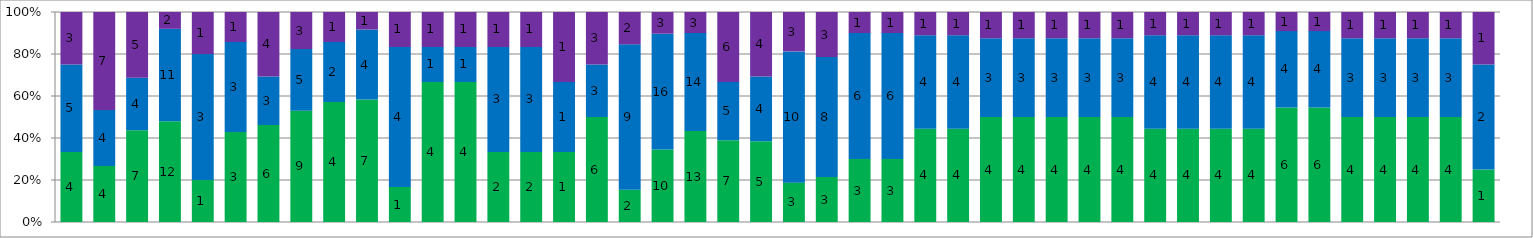
| Category | Wiedza | Umiejętności | Kompetencje społeczne |
|---|---|---|---|
| Podstawy psychoterapii | 4 | 5 | 3 |
| Filozofia i teoria opieki położniczej | 4 | 4 | 7 |
| Ustawodawstwo zawodowe położnej – wymogi europejskie | 7 | 4 | 5 |
| Zarządzanie w położnictwie | 12 | 11 | 2 |
| Egzamin magisterski seminarium magisterskie z promotorem | 1 | 3 | 1 |
| Przygotowanie do egzaminu magisteskiego teoretycznego i praktrycznego | 3 | 3 | 1 |
| Badania naukowe w położnictwie | 6 | 3 | 4 |
| Dydaktyka medyczna | 9 | 5 | 3 |
| Historia medycyny (Blok A i B) | 4 | 2 | 1 |
| Podstawy statystyki (Blok A i B) | 7 | 4 | 1 |
| Język angielski (Blok A i B) | 1 | 4 | 1 |
| Medycyna sądowa (Blok A) | 4 | 1 | 1 |
| Procedury sądowo-lekarskie w aspekcie zgonu pacjenta (Blok B) | 4 | 1 | 1 |
| Patologia i rehabilitacja mowy (Blok A) | 2 | 3 | 1 |
| Elementy logopedii i neurologopedii (Blok B) | 2 | 3 | 1 |
| Zajęcia fakultatywne (wolny wybór) | 1 | 1 | 1 |
| Nowoczesne techniki diagnostyczne | 6 | 3 | 3 |
| Diagnostyka ultrasonograficzna w położnictwie i ginekologii | 2 | 9 | 2 |
| Opieka specjalistyczna w położnictwie | 10 | 16 | 3 |
| Opieka specjalistyczna w ginekologii | 13 | 14 | 3 |
| Opieka specjalistyczna w neonatologii | 7 | 5 | 6 |
| Farmakologia kliniczna | 5 | 4 | 4 |
| Opieka środowiskowa nad kobietą i jej rodziną | 3 | 10 | 3 |
| Intensywny nadzór położniczy | 3 | 8 | 3 |
| Zakażenia szpitalne i leczenie ran (Blok A) | 3 | 6 | 1 |
| Pielęgniarstwo epidemiologiczne i leczenie ran (Blok B) | 3 | 6 | 1 |
| Medycyna prewencyjna w neonatologii (Blok A) | 4 | 4 | 1 |
| Profilaktyka chorób w neonatologii (Blok B) | 4 | 4 | 1 |
| Opieka paliatywna w perinatologii  (Blok A) | 4 | 3 | 1 |
| Opieka hospicyjna nad płodem i noworodkiem (Blok B) | 4 | 3 | 1 |
| Seksuologia | 4 | 3 | 1 |
| Poradnictwo laktacyjne (Blok A) | 4 | 3 | 1 |
| Prewencja i terapia problemów laktacyjnych (Blok B) | 4 | 3 | 1 |
| Endokrynologia ginekologiczna (Blok A) | 4 | 4 | 1 |
| Choroby układu endokrynologicznego w cyklu życia kobiety     (Blok B) | 4 | 4 | 1 |
| Kliniczne i społeczne aspekty rozrodczości człowieka (Blok A) | 4 | 4 | 1 |
| Medycyna rozroduw ujęciu psychospołecznym (Blok B) | 4 | 4 | 1 |
| Medycyna prewencyjna w położnictwie i ginekologii (Blok A) | 6 | 4 | 1 |
| Profilaktyka i edukacja zdrowotna w położnictwie i ginekologii (Blok B) | 6 | 4 | 1 |
| Onkologia ginekologiczna (Blok A)  | 4 | 3 | 1 |
| Schorzenia onkologiczne układu moczowo-płciowego kobiety       (Blok B) | 4 | 3 | 1 |
| Diagnostyka prenatalna i terapia wewnątrzmaciczna płodu        (Blok A) | 4 | 3 | 1 |
| Chirurgia płodu i diagnostyka okresu prenatalnego  (Blok B) | 4 | 3 | 1 |
| Zajęcia fakultatywne (wolny wybór) | 1 | 2 | 1 |